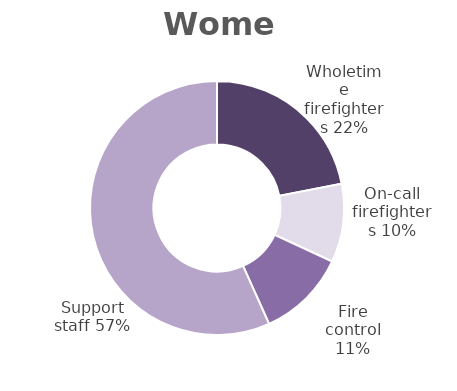
| Category | Women |
|---|---|
| Wholetime firefighters | 0.219 |
| On-call firefighters | 0.1 |
| Fire control | 0.114 |
| Support staff | 0.567 |